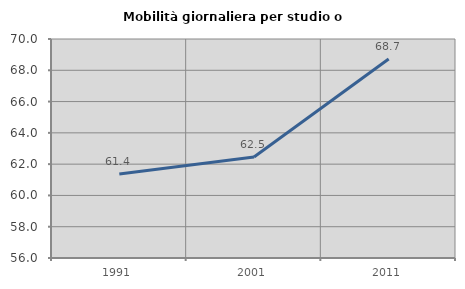
| Category | Mobilità giornaliera per studio o lavoro |
|---|---|
| 1991.0 | 61.372 |
| 2001.0 | 62.452 |
| 2011.0 | 68.726 |